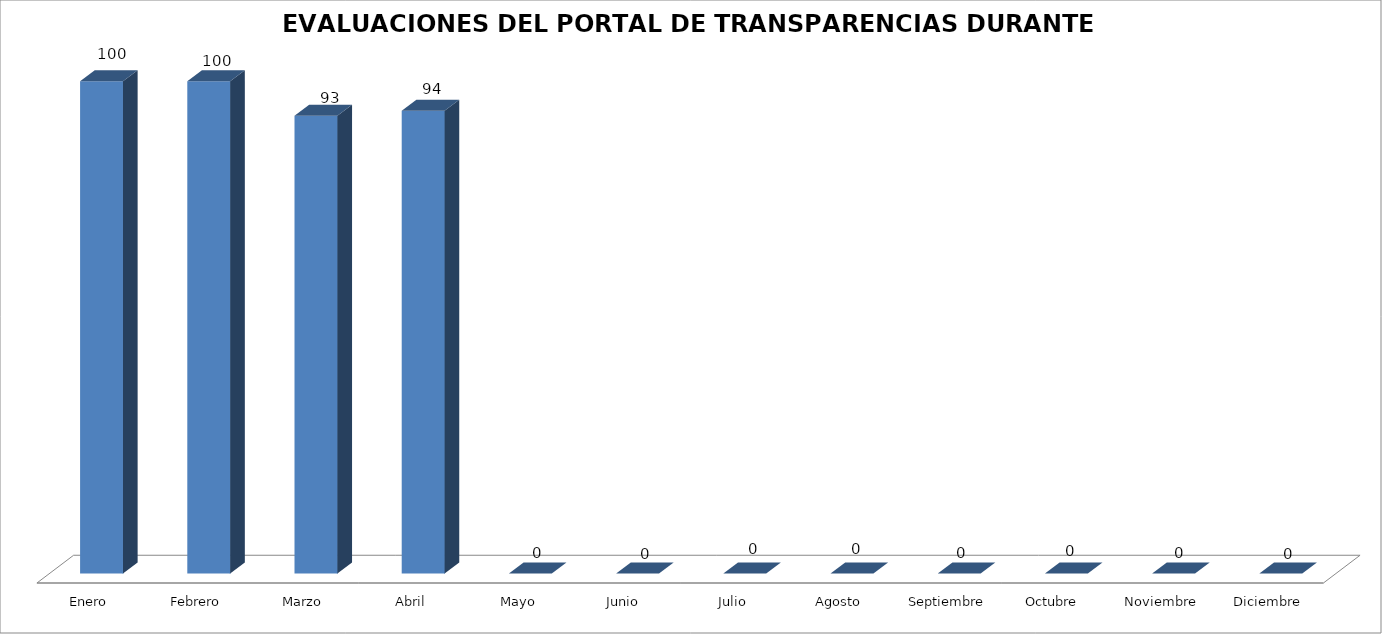
| Category | Series 0 |
|---|---|
| Enero | 100 |
| Febrero | 100 |
| Marzo | 93 |
| Abril | 94 |
| Mayo | 0 |
| Junio  | 0 |
| Julio | 0 |
| Agosto | 0 |
| Septiembre | 0 |
| Octubre  | 0 |
| Noviembre | 0 |
| Diciembre | 0 |